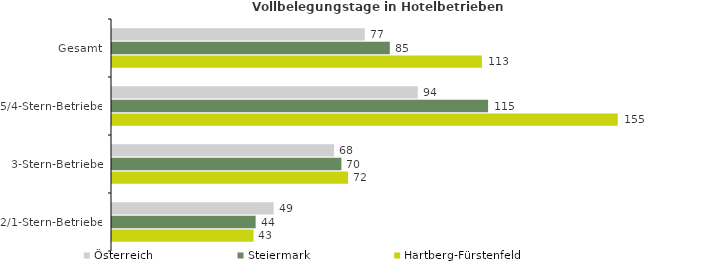
| Category | Österreich | Steiermark | Hartberg-Fürstenfeld |
|---|---|---|---|
| Gesamt | 77.394 | 85.042 | 113.234 |
| 5/4-Stern-Betriebe | 93.608 | 115.133 | 154.819 |
| 3-Stern-Betriebe | 67.992 | 70.225 | 72.243 |
| 2/1-Stern-Betriebe | 49.488 | 43.973 | 43.316 |